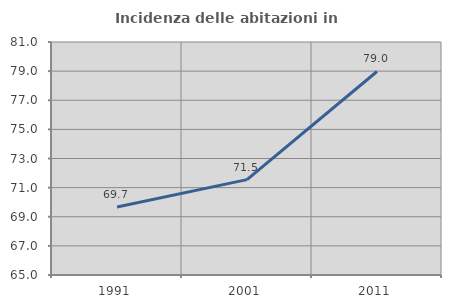
| Category | Incidenza delle abitazioni in proprietà  |
|---|---|
| 1991.0 | 69.675 |
| 2001.0 | 71.549 |
| 2011.0 | 78.974 |